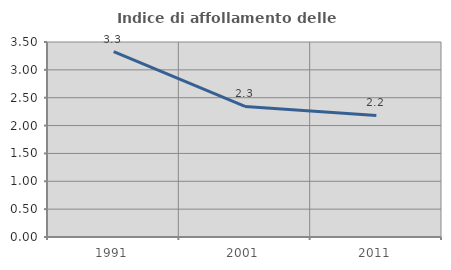
| Category | Indice di affollamento delle abitazioni  |
|---|---|
| 1991.0 | 3.327 |
| 2001.0 | 2.343 |
| 2011.0 | 2.182 |